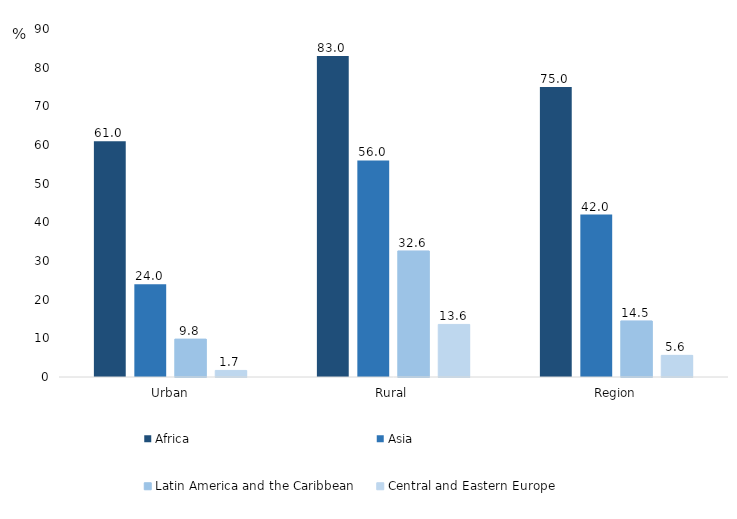
| Category | Africa | Asia | Latin America and the Caribbean | Central and Eastern Europe |
|---|---|---|---|---|
| Urban | 61 | 24 | 9.8 | 1.7 |
| Rural | 83 | 56 | 32.6 | 13.6 |
| Region | 75 | 42 | 14.5 | 5.6 |